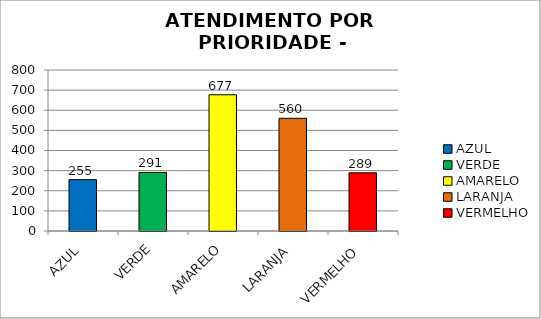
| Category | Total Regional: |
|---|---|
| AZUL | 255 |
| VERDE | 291 |
| AMARELO | 677 |
| LARANJA | 560 |
| VERMELHO | 289 |